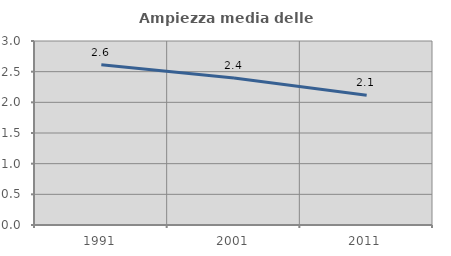
| Category | Ampiezza media delle famiglie |
|---|---|
| 1991.0 | 2.614 |
| 2001.0 | 2.396 |
| 2011.0 | 2.117 |